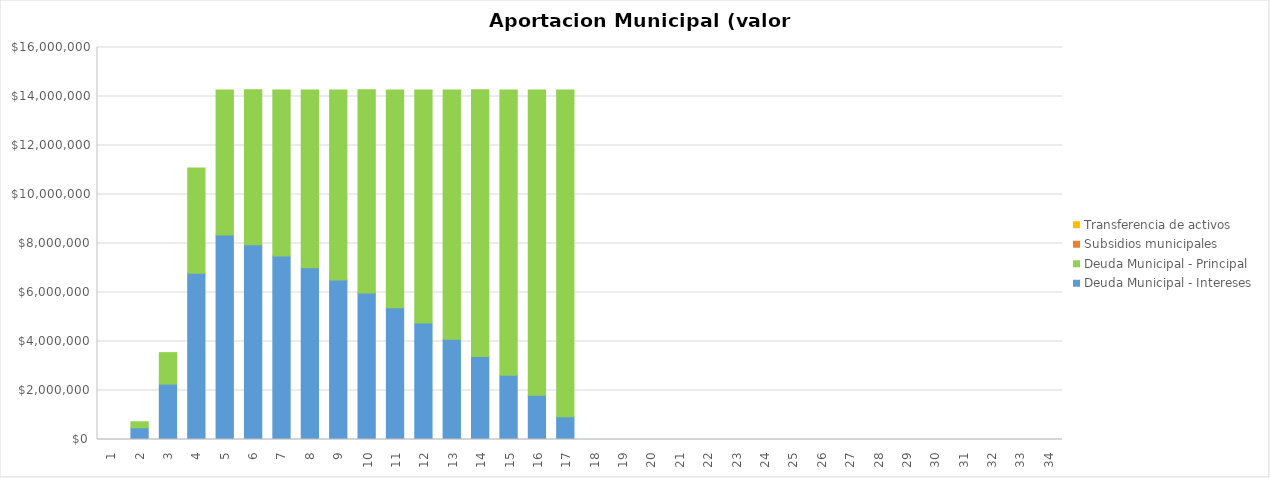
| Category | Deuda Municipal - Intereses | Deuda Municipal - Principal | Subsidios municipales | Transferencia de activos |
|---|---|---|---|---|
| 0 | 0 | 0 | 0 | 0 |
| 1 | 478781.933 | 244160.34 | 0 | 0 |
| 2 | 2260396.523 | 1285023.304 | 0 | 0 |
| 3 | 6784658.035 | 4298074.916 | 0 | 0 |
| 4 | 8344585.362 | 5918796.294 | 0 | 0 |
| 5 | 7952741.759 | 6325722.197 | 0 | 0 |
| 6 | 7487469.067 | 6776898.074 | 0 | 0 |
| 7 | 7013086.202 | 7251280.939 | 0 | 0 |
| 8 | 6505496.536 | 7758870.605 | 0 | 0 |
| 9 | 5979271.278 | 8296062.808 | 0 | 0 |
| 10 | 5381651.198 | 8883816.04 | 0 | 0 |
| 11 | 4759784.075 | 9505683.163 | 0 | 0 |
| 12 | 4094386.253 | 10171080.984 | 0 | 0 |
| 13 | 3391995.378 | 10879860.471 | 0 | 0 |
| 14 | 2620820.351 | 11645864.797 | 0 | 0 |
| 15 | 1805609.816 | 12461075.333 | 0 | 0 |
| 16 | 933334.542 | 13333350.606 | 0 | 0 |
| 17 | 0 | 0 | 0 | 0 |
| 18 | 0 | 0 | 0 | 0 |
| 19 | 0 | 0 | 0 | 0 |
| 20 | 0 | 0 | 0 | 0 |
| 21 | 0 | 0 | 0 | 0 |
| 22 | 0 | 0 | 0 | 0 |
| 23 | 0 | 0 | 0 | 0 |
| 24 | 0 | 0 | 0 | 0 |
| 25 | 0 | 0 | 0 | 0 |
| 26 | 0 | 0 | 0 | 0 |
| 27 | 0 | 0 | 0 | 0 |
| 28 | 0 | 0 | 0 | 0 |
| 29 | 0 | 0 | 0 | 0 |
| 30 | 0 | 0 | 0 | 0 |
| 31 | 0 | 0 | 0 | 0 |
| 32 | 0 | 0 | 0 | 0 |
| 33 | 0 | 0 | 0 | 0 |